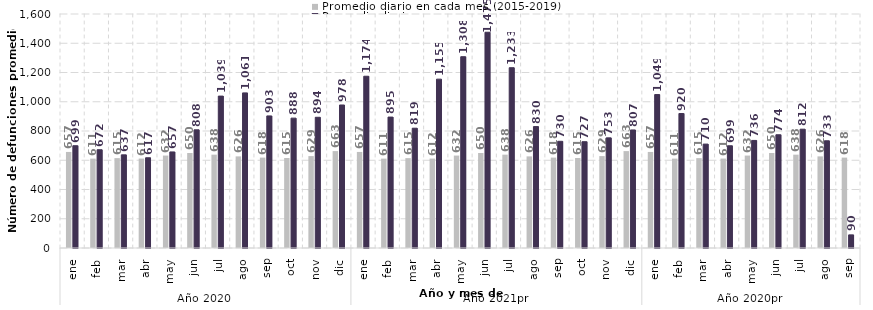
| Category | Promedio diario en cada mes (2015-2019) | Promedio diario |
|---|---|---|
| 0 | 656.794 | 699.387 |
| 1 | 611.097 | 671.862 |
| 2 | 614.516 | 637 |
| 3 | 611.54 | 617 |
| 4 | 632.077 | 656.774 |
| 5 | 649.54 | 808.2 |
| 6 | 638.271 | 1038.645 |
| 7 | 626.452 | 1060.677 |
| 8 | 618.193 | 903.133 |
| 9 | 615.303 | 888 |
| 10 | 628.567 | 893.733 |
| 11 | 662.645 | 977.806 |
| 12 | 656.794 | 1174.419 |
| 13 | 611.097 | 895.143 |
| 14 | 614.516 | 819.032 |
| 15 | 611.54 | 1154.5 |
| 16 | 632.077 | 1308.032 |
| 17 | 649.54 | 1475.233 |
| 18 | 638.271 | 1232.903 |
| 19 | 626.452 | 830.29 |
| 20 | 618.193 | 729.567 |
| 21 | 615.303 | 726.774 |
| 22 | 628.567 | 753.167 |
| 23 | 662.645 | 807.097 |
| 24 | 656.794 | 1049.194 |
| 25 | 611.097 | 919.5 |
| 26 | 614.516 | 710.4 |
| 27 | 611.54 | 699.067 |
| 28 | 632.077 | 735.548 |
| 29 | 649.54 | 774.3 |
| 30 | 638.271 | 812.323 |
| 31 | 626.452 | 733.129 |
| 32 | 618.193 | 89.7 |